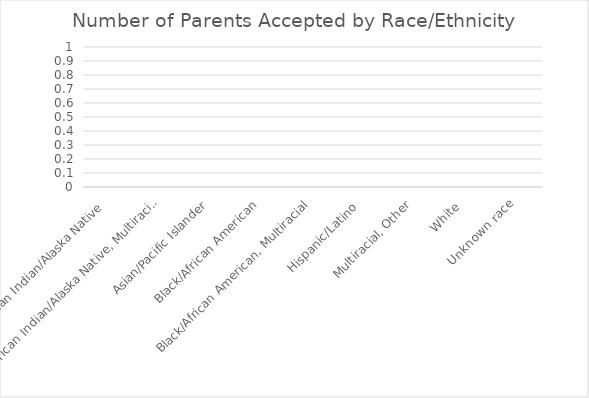
| Category | Accepted |
|---|---|
| American Indian/Alaska Native  | 0 |
| American Indian/Alaska Native, Multiracial | 0 |
| Asian/Pacific Islander | 0 |
| Black/African American | 0 |
| Black/African American, Multiracial | 0 |
| Hispanic/Latino  | 0 |
| Multiracial, Other | 0 |
| White  | 0 |
| Unknown race | 0 |